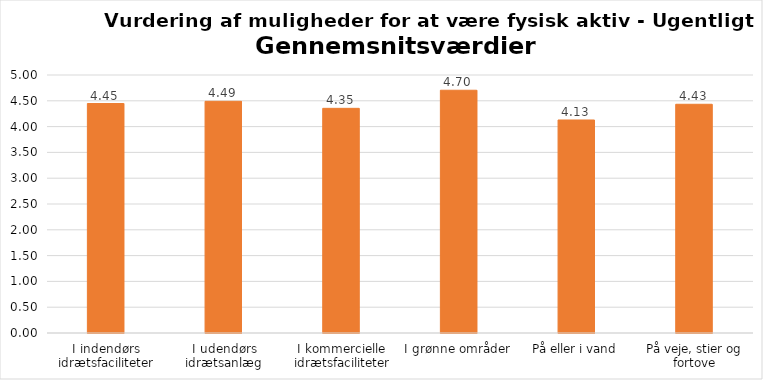
| Category | Gennemsnit |
|---|---|
| I indendørs idrætsfaciliteter | 4.447 |
| I udendørs idrætsanlæg | 4.49 |
| I kommercielle idrætsfaciliteter | 4.354 |
| I grønne områder | 4.704 |
| På eller i vand | 4.128 |
| På veje, stier og fortove | 4.433 |